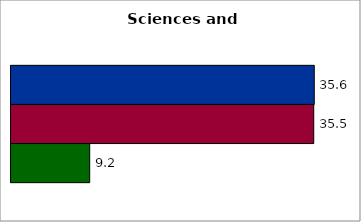
| Category | 50 states and D.C. | SREB states | State |
|---|---|---|---|
| 0 | 35.574 | 35.511 | 9.232 |